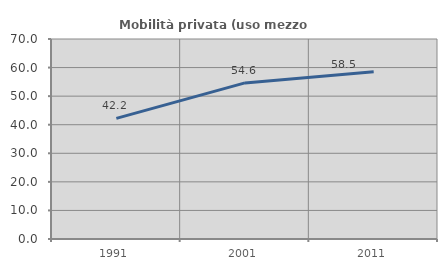
| Category | Mobilità privata (uso mezzo privato) |
|---|---|
| 1991.0 | 42.227 |
| 2001.0 | 54.638 |
| 2011.0 | 58.529 |